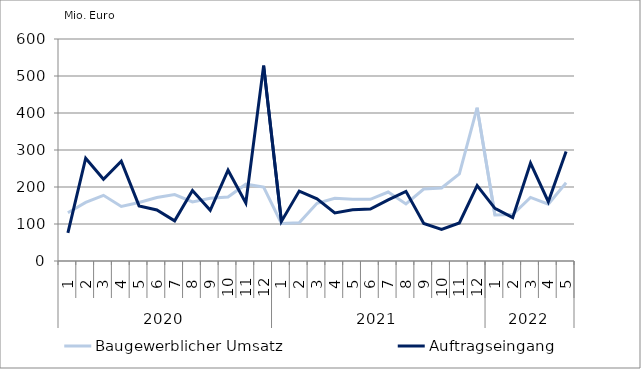
| Category | Baugewerblicher Umsatz | Auftragseingang |
|---|---|---|
| 0 | 130445.562 | 75891.481 |
| 1 | 158433.655 | 277923.85 |
| 2 | 177529.832 | 220973.626 |
| 3 | 147259.799 | 269936.091 |
| 4 | 157965.891 | 149072.895 |
| 5 | 171647.778 | 137984.76 |
| 6 | 179530.732 | 108645.965 |
| 7 | 159480.457 | 190771.468 |
| 8 | 169638.111 | 136988.906 |
| 9 | 173040.053 | 245341.603 |
| 10 | 207619.085 | 156647.224 |
| 11 | 199947.086 | 528166.004 |
| 12 | 101295.895 | 106850.127 |
| 13 | 103236.543 | 188883.434 |
| 14 | 156172.725 | 168204.42 |
| 15 | 169257.088 | 130052.073 |
| 16 | 166897.821 | 138492.214 |
| 17 | 166720.216 | 140262.426 |
| 18 | 186515.191 | 165331.191 |
| 19 | 154188.941 | 188169.655 |
| 20 | 194464.12 | 101359.538 |
| 21 | 197281.201 | 85626.862 |
| 22 | 235325.083 | 102880.924 |
| 23 | 414469.471 | 203900.676 |
| 24 | 124217.549 | 142351.759 |
| 25 | 125619.696 | 117194.423 |
| 26 | 171896.664 | 264509.013 |
| 27 | 153384.654 | 160146.519 |
| 28 | 211335.38 | 295997.826 |